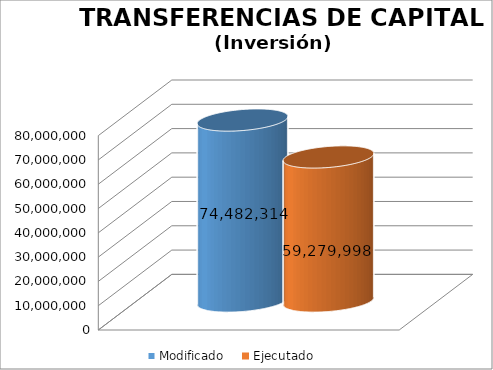
| Category | Modificado | Ejecutado |
|---|---|---|
| 0 | 74482314 | 59279997.56 |